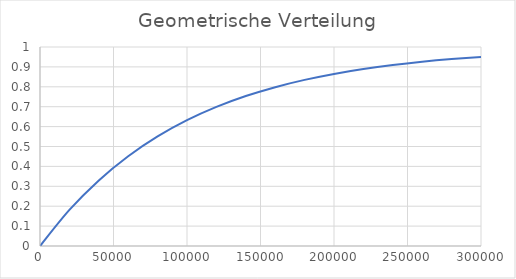
| Category | Series 0 |
|---|---|
| 0.0 | 0 |
| 20000.0 | 0.181 |
| 40000.0 | 0.33 |
| 60000.0 | 0.451 |
| 80000.0 | 0.551 |
| 100000.0 | 0.632 |
| 120000.0 | 0.699 |
| 140000.0 | 0.753 |
| 160000.0 | 0.798 |
| 180000.0 | 0.835 |
| 200000.0 | 0.865 |
| 220000.0 | 0.889 |
| 240000.0 | 0.909 |
| 260000.0 | 0.926 |
| 280000.0 | 0.939 |
| 300000.0 | 0.95 |